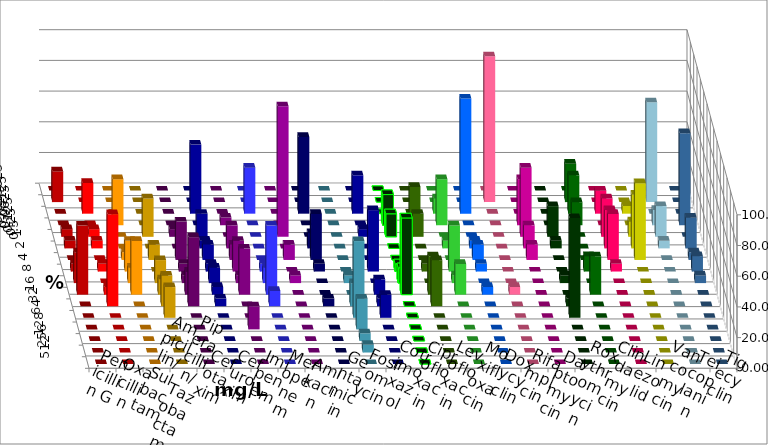
| Category | Penicillin G | Oxacillin | Ampicillin/ Sulbactam | Piperacillin/ Tazobactam | Cefotaxim | Cefuroxim | Imipenem | Meropenem | Amikacin | Gentamicin | Fosfomycin | Cotrimoxazol | Ciprofloxacin | Levofloxacin | Moxifloxacin | Doxycyclin | Rifampicin | Daptomycin | Roxythromycin | Clindamycin | Linezolid | Vancomycin | Teicoplanin | Tigecyclin |
|---|---|---|---|---|---|---|---|---|---|---|---|---|---|---|---|---|---|---|---|---|---|---|---|---|
| 0.015625 | 0 | 0 | 0 | 0 | 0 | 0 | 0 | 0 | 0 | 0 | 0 | 0 | 0 | 0 | 0 | 0 | 0 | 0 | 0 | 0 | 0 | 0 | 0 | 0 |
| 0.03125 | 20 | 0 | 0 | 0 | 0 | 0 | 0 | 0 | 0 | 0 | 0 | 0 | 0 | 0 | 0 | 0 | 95 | 0 | 0 | 25 | 0 | 0 | 0 | 65 |
| 0.0625 | 0 | 20 | 0 | 0 | 0 | 0 | 45 | 30 | 0 | 50 | 0 | 25 | 0 | 0 | 10 | 75 | 0 | 0 | 0 | 25 | 15 | 5 | 0 | 0 |
| 0.125 | 0 | 0 | 30 | 0 | 0 | 5 | 0 | 0 | 0 | 0 | 0 | 0 | 20 | 25 | 30 | 0 | 0 | 30 | 0 | 15 | 0 | 0 | 60 | 10 |
| 0.25 | 5 | 5 | 0 | 25 | 5 | 0 | 15 | 0 | 85 | 0 | 0 | 5 | 15 | 15 | 0 | 0 | 0 | 45 | 20 | 0 | 25 | 10 | 0 | 20 |
| 0.5 | 5 | 5 | 0 | 0 | 0 | 15 | 5 | 0 | 0 | 10 | 0 | 0 | 0 | 0 | 5 | 5 | 0 | 15 | 5 | 0 | 25 | 35 | 20 | 5 |
| 1.0 | 0 | 0 | 5 | 10 | 25 | 10 | 10 | 0 | 10 | 30 | 0 | 0 | 0 | 0 | 0 | 10 | 0 | 10 | 0 | 0 | 30 | 50 | 5 | 0 |
| 2.0 | 5 | 5 | 20 | 0 | 5 | 20 | 5 | 5 | 0 | 5 | 0 | 40 | 5 | 5 | 30 | 5 | 0 | 0 | 0 | 10 | 5 | 0 | 10 | 0 |
| 4.0 | 20 | 0 | 10 | 15 | 5 | 5 | 10 | 10 | 5 | 0 | 5 | 0 | 10 | 0 | 5 | 0 | 0 | 0 | 5 | 0 | 0 | 0 | 5 | 0 |
| 8.0 | 45 | 5 | 35 | 10 | 15 | 30 | 5 | 45 | 0 | 0 | 0 | 10 | 50 | 25 | 20 | 5 | 5 | 0 | 0 | 25 | 0 | 0 | 0 | 0 |
| 16.0 | 0 | 60 | 0 | 20 | 45 | 0 | 5 | 10 | 0 | 5 | 15 | 5 | 0 | 30 | 0 | 0 | 0 | 0 | 5 | 0 | 0 | 0 | 0 | 0 |
| 32.0 | 0 | 0 | 0 | 20 | 0 | 0 | 0 | 0 | 0 | 0 | 50 | 15 | 0 | 0 | 0 | 0 | 0 | 0 | 65 | 0 | 0 | 0 | 0 | 0 |
| 64.0 | 0 | 0 | 0 | 0 | 0 | 15 | 0 | 0 | 0 | 0 | 20 | 0 | 0 | 0 | 0 | 0 | 0 | 0 | 0 | 0 | 0 | 0 | 0 | 0 |
| 128.0 | 0 | 0 | 0 | 0 | 0 | 0 | 0 | 0 | 0 | 0 | 5 | 0 | 0 | 0 | 0 | 0 | 0 | 0 | 0 | 0 | 0 | 0 | 0 | 0 |
| 256.0 | 0 | 0 | 0 | 0 | 0 | 0 | 0 | 0 | 0 | 0 | 5 | 0 | 0 | 0 | 0 | 0 | 0 | 0 | 0 | 0 | 0 | 0 | 0 | 0 |
| 512.0 | 0 | 0 | 0 | 0 | 0 | 0 | 0 | 0 | 0 | 0 | 0 | 0 | 0 | 0 | 0 | 0 | 0 | 0 | 0 | 0 | 0 | 0 | 0 | 0 |